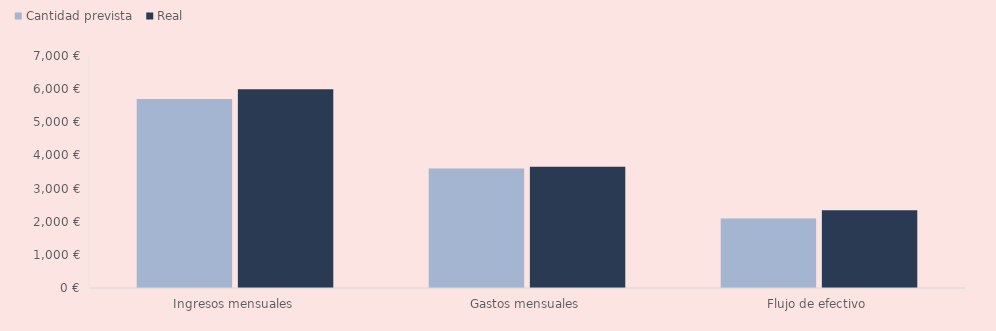
| Category | Cantidad prevista | Real |
|---|---|---|
| Ingresos mensuales | 5700 | 6000 |
| Gastos mensuales | 3603 | 3655 |
| Flujo de efectivo | 2097 | 2345 |